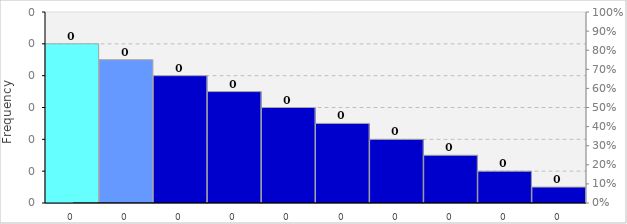
| Category | Freq |
|---|---|
| 0.0 | 0.1 |
| 0.0 | 0.09 |
| 0.0 | 0.08 |
| 0.0 | 0.07 |
| 0.0 | 0.06 |
| 0.0 | 0.05 |
| 0.0 | 0.04 |
| 0.0 | 0.03 |
| 0.0 | 0.02 |
| 0.0 | 0.01 |